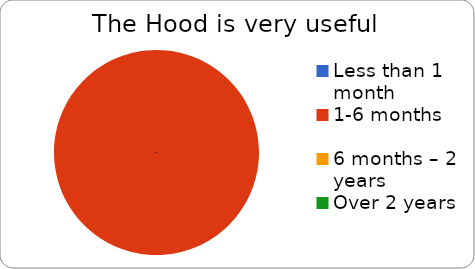
| Category | Very useful |
|---|---|
| Less than 1 month | 0 |
| 1-6 months | 1 |
| 6 months – 2 years | 0 |
| Over 2 years | 0 |